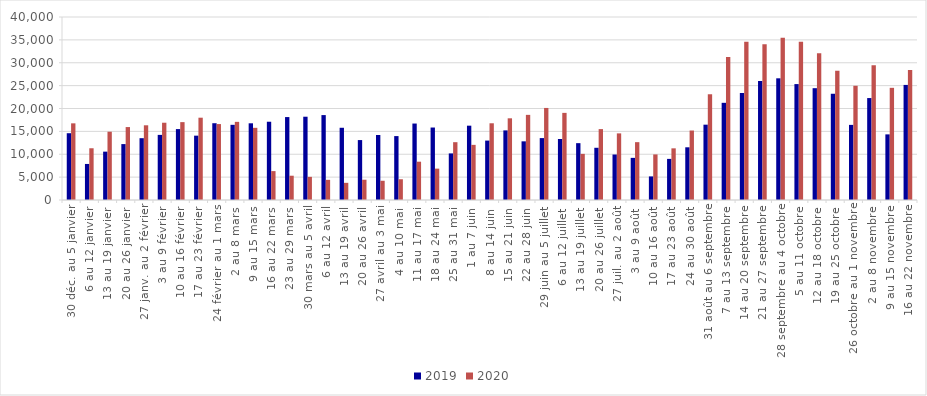
| Category | 2019 | 2020 |
|---|---|---|
| 30 déc. au 5 janvier | 14597 | 16757 |
| 6 au 12 janvier | 7879 | 11309 |
| 13 au 19 janvier | 10570 | 14927 |
| 20 au 26 janvier | 12222 | 15942 |
| 27 janv. au 2 février | 13510 | 16329 |
| 3 au 9 février | 14232 | 16890 |
| 10 au 16 février | 15499 | 17021 |
| 17 au 23 février | 14063 | 17990 |
| 24 février au 1 mars | 16783 | 16596 |
| 2 au 8 mars | 16432 | 17081 |
| 9 au 15 mars | 16765 | 15777 |
| 16 au 22 mars | 17107 | 6318 |
| 23 au 29 mars | 18126 | 5309 |
| 30 mars au 5 avril | 18204 | 5060 |
| 6 au 12 avril | 18560 | 4405 |
| 13 au 19 avril | 15788 | 3752 |
| 20 au 26 avril | 13099 | 4432 |
| 27 avril au 3 mai | 14207 | 4206 |
| 4 au 10 mai | 13969 | 4538 |
| 11 au 17 mai | 16713 | 8374 |
| 18 au 24 mai | 15841 | 6856 |
| 25 au 31 mai | 10184 | 12637 |
| 1 au 7 juin | 16246 | 12052 |
| 8 au 14 juin | 12988 | 16771 |
| 15 au 21 juin | 15214 | 17856 |
| 22 au 28 juin | 12823 | 18610 |
| 29 juin au 5 juillet | 13531 | 20122 |
| 6 au 12 juillet | 13339 | 19044 |
| 13 au 19 juillet | 12424 | 10087 |
| 20 au 26 juillet | 11414 | 15497 |
| 27 juil. au 2 août | 9944 | 14562 |
| 3 au 9 août | 9210 | 12644 |
| 10 au 16 août | 5155 | 9963 |
| 17 au 23 août | 8985 | 11292 |
| 24 au 30 août | 11520 | 15188 |
| 31 août au 6 septembre | 16465 | 23113 |
| 7 au 13 septembre | 21242 | 31250 |
| 14 au 20 septembre | 23386 | 34617 |
| 21 au 27 septembre | 26016 | 34033 |
| 28 septembre au 4 octobre | 26599 | 35462 |
| 5 au 11 octobre | 25337 | 34604 |
| 12 au 18 octobre | 24442 | 32083 |
| 19 au 25 octobre | 23222 | 28243 |
| 26 octobre au 1 novembre | 16420 | 24968 |
| 2 au 8 novembre | 22282 | 29438 |
| 9 au 15 novembre | 14343 | 24519 |
| 16 au 22 novembre | 25154 | 28396 |